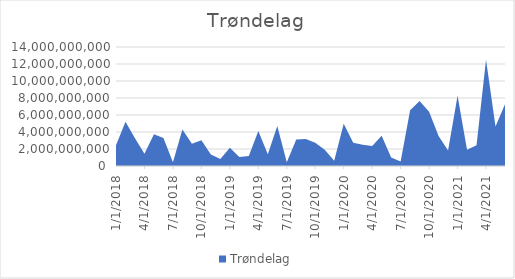
| Category | Trøndelag |
|---|---|
| 1/1/18 | 2453050005 |
| 2/1/18 | 5191300000 |
| 3/1/18 | 3271980000 |
| 4/1/18 | 1455030000 |
| 5/1/18 | 3723665000 |
| 6/1/18 | 3305660000 |
| 7/1/18 | 441850000 |
| 8/1/18 | 4287195000 |
| 9/1/18 | 2613400000 |
| 10/1/18 | 3027059000 |
| 11/1/18 | 1359050000 |
| 12/1/18 | 835950000 |
| 1/1/19 | 2140600000 |
| 2/1/19 | 1057200000 |
| 3/1/19 | 1170650000 |
| 4/1/19 | 4118300000 |
| 5/1/19 | 1394410000 |
| 6/1/19 | 4704600000 |
| 7/1/19 | 453900000 |
| 8/1/19 | 3122600000 |
| 9/1/19 | 3190250000 |
| 10/1/19 | 2741650000 |
| 11/1/19 | 1916250000 |
| 12/1/19 | 626500000 |
| 1/1/20 | 4963300000 |
| 2/1/20 | 2736000000 |
| 3/1/20 | 2495000000 |
| 4/1/20 | 2345250000 |
| 5/1/20 | 3544850000 |
| 6/1/20 | 994450000 |
| 7/1/20 | 541600000 |
| 8/1/20 | 6555090000 |
| 9/1/20 | 7647050000 |
| 10/1/20 | 6374975000 |
| 11/1/20 | 3530400000 |
| 12/1/20 | 1814100000 |
| 1/1/21 | 8253450000 |
| 2/1/21 | 1912250000 |
| 3/1/21 | 2455850000 |
| 4/1/21 | 12510150000 |
| 5/1/21 | 4643650000 |
| 6/1/21 | 7262980000 |